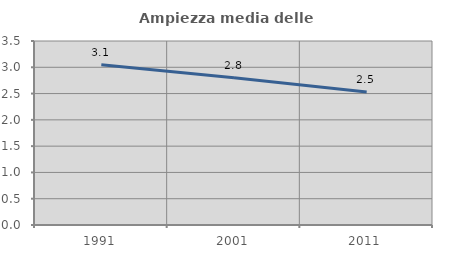
| Category | Ampiezza media delle famiglie |
|---|---|
| 1991.0 | 3.05 |
| 2001.0 | 2.8 |
| 2011.0 | 2.528 |